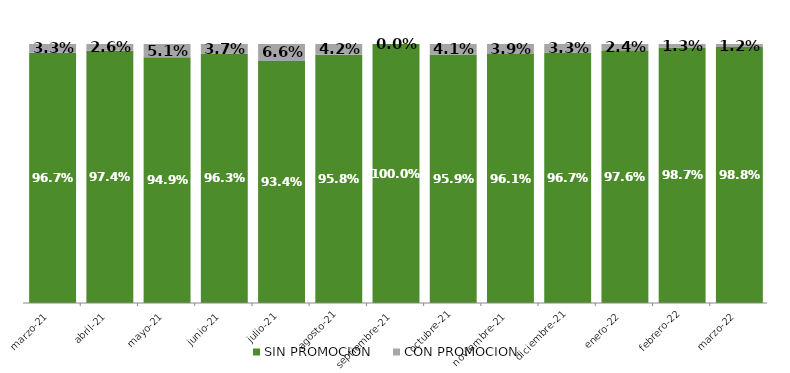
| Category | SIN PROMOCION   | CON PROMOCION   |
|---|---|---|
| 2021-03-01 | 0.967 | 0.033 |
| 2021-04-01 | 0.974 | 0.026 |
| 2021-05-01 | 0.949 | 0.051 |
| 2021-06-01 | 0.963 | 0.037 |
| 2021-07-01 | 0.934 | 0.066 |
| 2021-08-01 | 0.958 | 0.042 |
| 2021-09-01 | 1 | 0 |
| 2021-10-01 | 0.959 | 0.041 |
| 2021-11-01 | 0.961 | 0.039 |
| 2021-12-01 | 0.967 | 0.033 |
| 2022-01-01 | 0.976 | 0.024 |
| 2022-02-01 | 0.987 | 0.013 |
| 2022-03-01 | 0.988 | 0.012 |